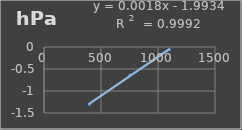
| Category | Presión Atmosférica |
|---|---|
| 397.9 | -1.3 |
| 753.2 | -0.641 |
| 1099.3 | -0.06 |